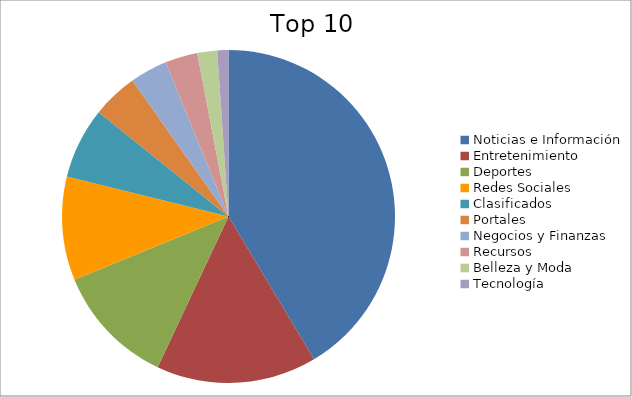
| Category | Series 0 |
|---|---|
| Noticias e Información | 39.82 |
| Entretenimiento | 14.98 |
| Deportes | 11.35 |
| Redes Sociales | 9.68 |
| Clasificados | 6.65 |
| Portales | 4.26 |
| Negocios y Finanzas | 3.49 |
| Recursos | 3.03 |
| Belleza y Moda | 1.85 |
| Tecnología | 1.04 |